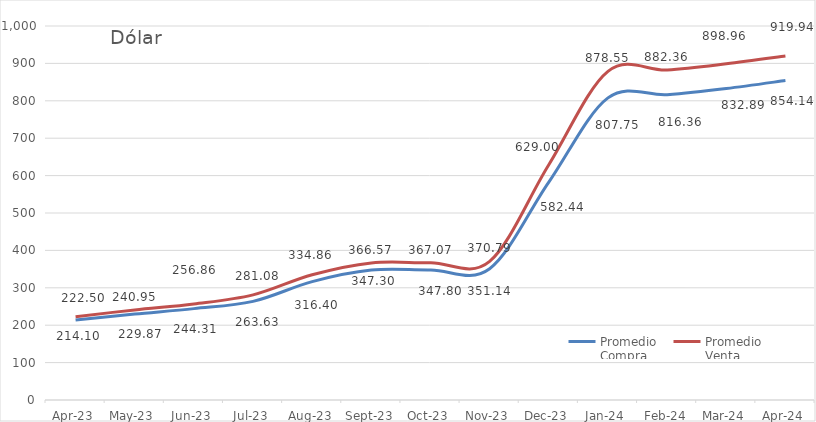
| Category | Promedio
Compra  | Promedio
Venta |
|---|---|---|
| 2023-04-01 | 214.101 | 222.501 |
| 2023-05-01 | 229.866 | 240.948 |
| 2023-06-01 | 244.308 | 256.864 |
| 2023-07-01 | 263.63 | 281.078 |
| 2023-08-01 | 316.4 | 334.86 |
| 2023-09-01 | 347.296 | 366.566 |
| 2023-10-01 | 347.796 | 367.066 |
| 2023-11-01 | 351.14 | 370.791 |
| 2023-12-01 | 582.44 | 629 |
| 2024-01-01 | 807.748 | 878.548 |
| 2024-02-01 | 816.363 | 882.363 |
| 2024-03-01 | 832.888 | 898.96 |
| 2024-04-01 | 854.139 | 919.939 |